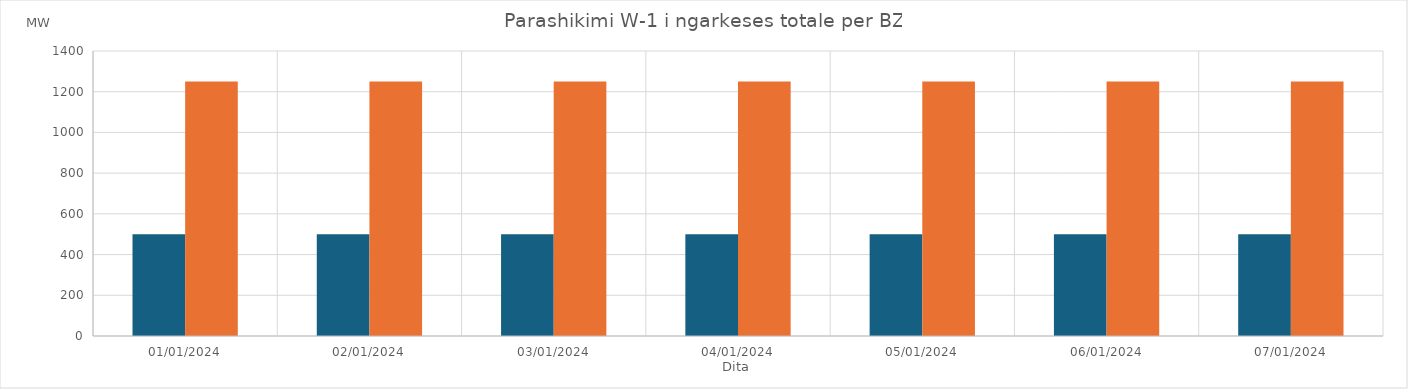
| Category | Min (MW) | Max (MW) |
|---|---|---|
| 01/01/2024 | 500 | 1250 |
| 02/01/2024 | 500 | 1250 |
| 03/01/2024 | 500 | 1250 |
| 04/01/2024 | 500 | 1250 |
| 05/01/2024 | 500 | 1250 |
| 06/01/2024 | 500 | 1250 |
| 07/01/2024 | 500 | 1250 |